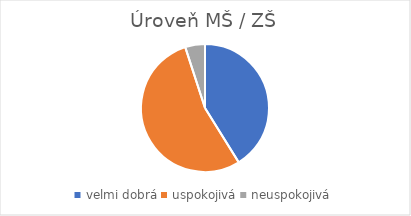
| Category | Úroveň MŠ / ZŠ |
|---|---|
| velmi dobrá | 107 |
| uspokojivá | 140 |
| neuspokojivá | 13 |